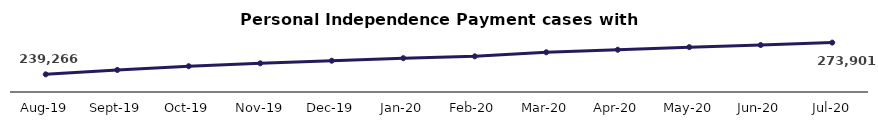
| Category | Series 0 |
|---|---|
| 2019-08-01 | 239266 |
| 2019-09-01 | 244019 |
| 2019-10-01 | 248143 |
| 2019-11-01 | 251272 |
| 2019-12-01 | 254126 |
| 2020-01-01 | 256925 |
| 2020-02-01 | 258908 |
| 2020-03-01 | 263317 |
| 2020-04-01 | 266092 |
| 2020-05-01 | 268928 |
| 2020-06-01 | 271216 |
| 2020-07-01 | 273901 |